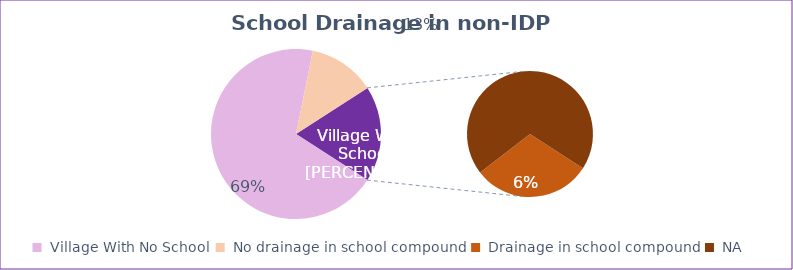
| Category | Series 0 |
|---|---|
|  Village With No School  | 87 |
|  No drainage in school compound  | 16 |
|  Drainage in school compound  | 7 |
|  NA  | 16 |